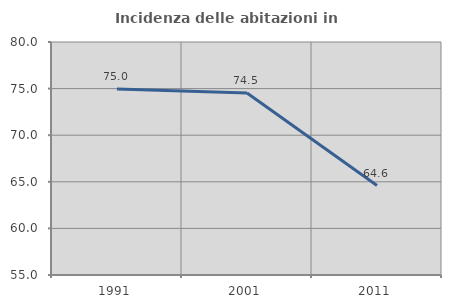
| Category | Incidenza delle abitazioni in proprietà  |
|---|---|
| 1991.0 | 74.966 |
| 2001.0 | 74.538 |
| 2011.0 | 64.598 |